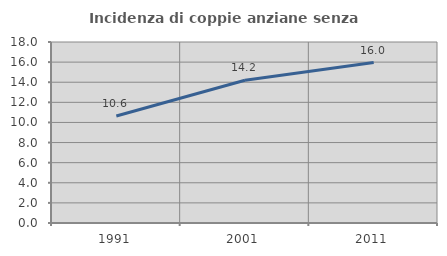
| Category | Incidenza di coppie anziane senza figli  |
|---|---|
| 1991.0 | 10.643 |
| 2001.0 | 14.189 |
| 2011.0 | 15.955 |